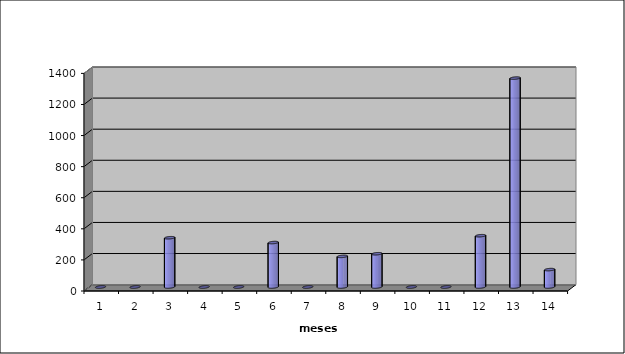
| Category | Series 0 | Series 1 |
|---|---|---|
| 0 | 0 |  |
| 1 | 0 |  |
| 2 | 317 |  |
| 3 | 0 |  |
| 4 | 0 |  |
| 5 | 286 |  |
| 6 | 0 |  |
| 7 | 197 |  |
| 8 | 214 |  |
| 9 | 0 |  |
| 10 | 0 |  |
| 11 | 330 |  |
| 12 | 1344 |  |
| 13 | 112 |  |